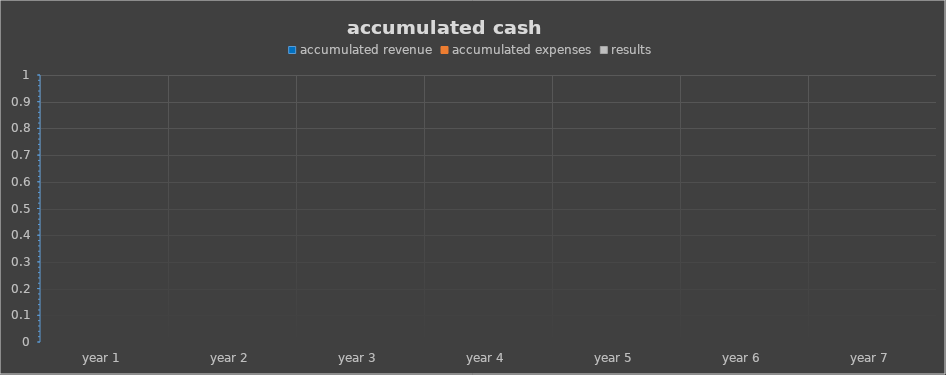
| Category | accumulated revenue | accumulated expenses | results |
|---|---|---|---|
| year 1 | 0 | 0 | 0 |
| year 2 | 0 | 0 | 0 |
| year 3 | 0 | 0 | 0 |
| year 4 | 0 | 0 | 0 |
| year 5 | 0 | 0 | 0 |
| year 6 | 0 | 0 | 0 |
| year 7 | 0 | 0 | 0 |